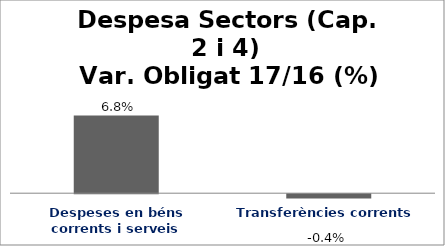
| Category | Series 0 |
|---|---|
| Despeses en béns corrents i serveis | 0.068 |
| Transferències corrents | -0.004 |